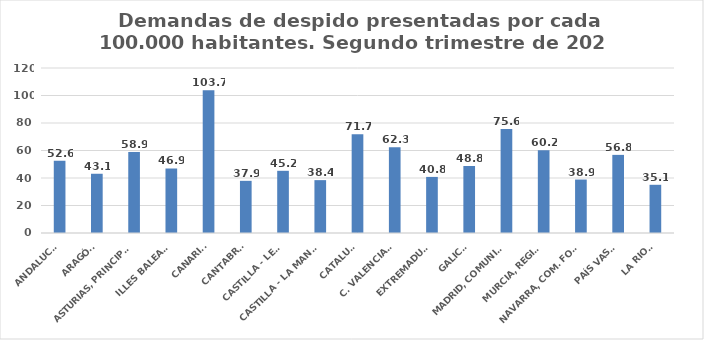
| Category | Series 0 |
|---|---|
| ANDALUCÍA | 52.587 |
| ARAGÓN | 43.083 |
| ASTURIAS, PRINCIPADO | 58.935 |
| ILLES BALEARS | 46.929 |
| CANARIAS | 103.749 |
| CANTABRIA | 37.934 |
| CASTILLA - LEÓN | 45.231 |
| CASTILLA - LA MANCHA | 38.447 |
| CATALUÑA | 71.73 |
| C. VALENCIANA | 62.288 |
| EXTREMADURA | 40.787 |
| GALICIA | 48.789 |
| MADRID, COMUNIDAD | 75.618 |
| MURCIA, REGIÓN | 60.205 |
| NAVARRA, COM. FORAL | 38.878 |
| PAÍS VASCO | 56.814 |
| LA RIOJA | 35.056 |